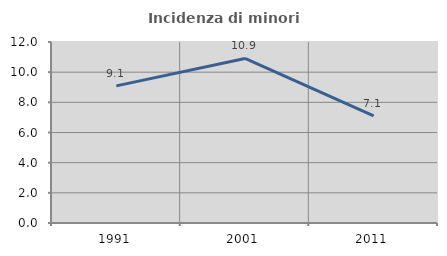
| Category | Incidenza di minori stranieri |
|---|---|
| 1991.0 | 9.091 |
| 2001.0 | 10.909 |
| 2011.0 | 7.101 |